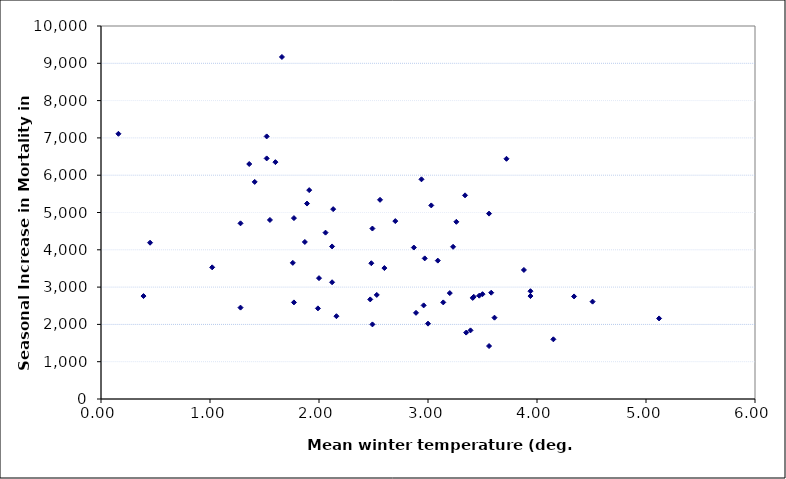
| Category | Seas Incr. Mort. |
|---|---|
| 1.89 | 5240 |
| 2.94 | 5890 |
| 2.7 | 4770 |
| 1.41 | 5820 |
| 1.52 | 6450 |
| 3.47 | 2770 |
| 2.06 | 4460 |
| 1.66 | 9170 |
| 2.12 | 4090 |
| 2.56 | 5340 |
| 2.13 | 5090 |
| 0.16 | 7110 |
| 3.09 | 3710 |
| 1.87 | 4210 |
| 1.6 | 6350 |
| 3.0 | 2020 |
| 1.91 | 5600 |
| 1.55 | 4800 |
| 1.52 | 7040 |
| 3.41 | 2710 |
| 3.56 | 4970 |
| 3.23 | 4080 |
| 3.5 | 2810 |
| 3.88 | 3460 |
| 3.72 | 6440 |
| 1.02 | 3530 |
| 1.77 | 4850 |
| 0.45 | 4190 |
| 2.47 | 2670 |
| 2.97 | 3770 |
| 1.36 | 6300 |
| 2.49 | 4570 |
| 2.53 | 2790 |
| 2.12 | 3130 |
| 1.28 | 4710 |
| 2.0 | 3240 |
| 3.14 | 2590 |
| 5.12 | 2160 |
| 3.34 | 5460 |
| 1.99 | 2430 |
| 3.94 | 2890 |
| 3.42 | 2740 |
| 1.77 | 2590 |
| 2.89 | 2310 |
| 1.76 | 3650 |
| 2.48 | 3640 |
| 4.51 | 2610 |
| 3.26 | 4750 |
| 3.03 | 5190 |
| 2.16 | 2220 |
| 3.39 | 1840 |
| 2.96 | 2510 |
| 3.2 | 2840 |
| 3.94 | 2760 |
| 3.35 | 1780 |
| 4.34 | 2750 |
| 3.61 | 2180 |
| 2.6 | 3510 |
| 0.39 | 2760 |
| 1.28 | 2450 |
| 3.56 | 1420 |
| 2.49 | 2000 |
| 4.15 | 1600 |
| 2.87 | 4060 |
| 3.58 | 2850 |